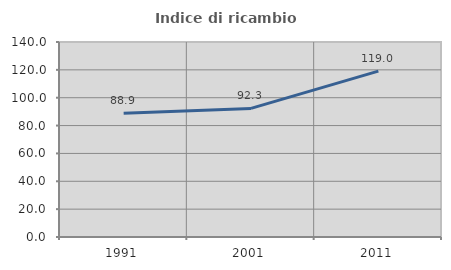
| Category | Indice di ricambio occupazionale  |
|---|---|
| 1991.0 | 88.889 |
| 2001.0 | 92.308 |
| 2011.0 | 119.048 |